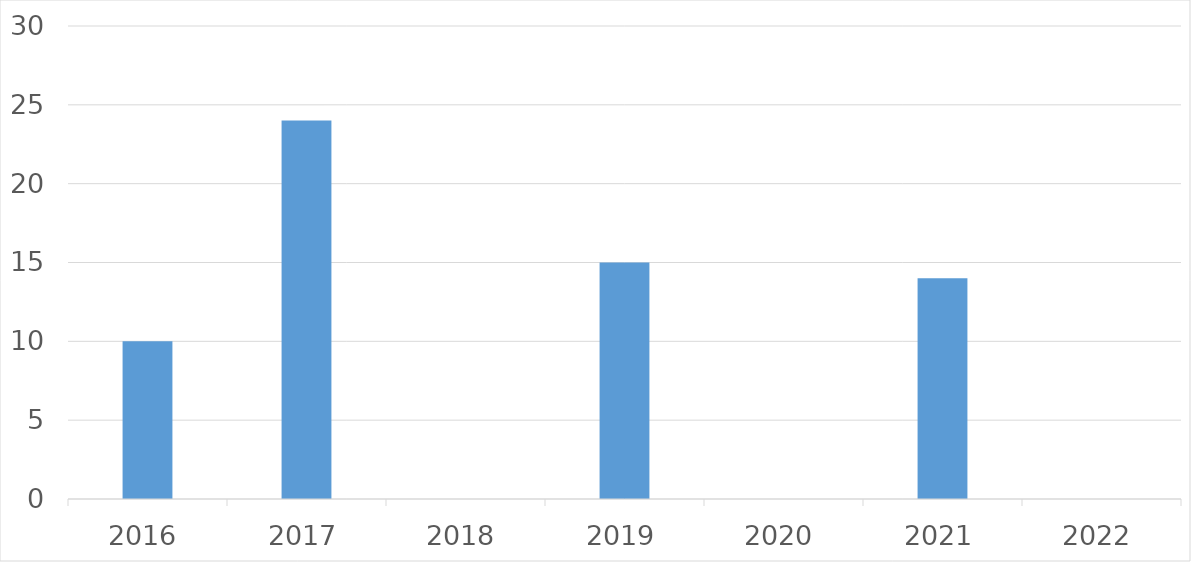
| Category | Series 0 |
|---|---|
| 2016 | 10 |
| 2017 | 24 |
| 2018 | 0 |
| 2019 | 15 |
| 2020 | 0 |
| 2021 | 14 |
| 2022 | 0 |